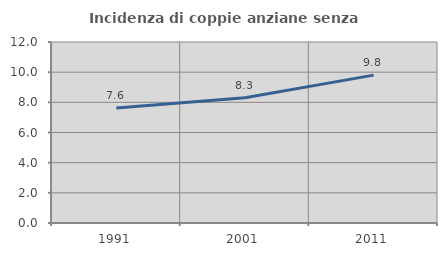
| Category | Incidenza di coppie anziane senza figli  |
|---|---|
| 1991.0 | 7.623 |
| 2001.0 | 8.3 |
| 2011.0 | 9.804 |